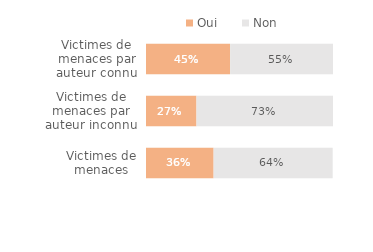
| Category | Oui | Non |
|---|---|---|
| Victimes de menaces | 0.362 | 0.637 |
| Victimes de menaces par auteur inconnu | 0.27 | 0.73 |
| Victimes de menaces par auteur connu | 0.45 | 0.55 |